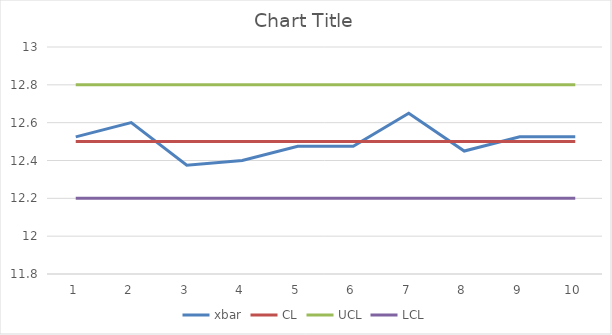
| Category | xbar | CL | UCL | LCL |
|---|---|---|---|---|
| 0 | 12.525 | 12.5 | 12.8 | 12.2 |
| 1 | 12.6 | 12.5 | 12.8 | 12.2 |
| 2 | 12.375 | 12.5 | 12.8 | 12.2 |
| 3 | 12.4 | 12.5 | 12.8 | 12.2 |
| 4 | 12.475 | 12.5 | 12.8 | 12.2 |
| 5 | 12.475 | 12.5 | 12.8 | 12.2 |
| 6 | 12.65 | 12.5 | 12.8 | 12.2 |
| 7 | 12.45 | 12.5 | 12.8 | 12.2 |
| 8 | 12.525 | 12.5 | 12.8 | 12.2 |
| 9 | 12.525 | 12.5 | 12.8 | 12.2 |